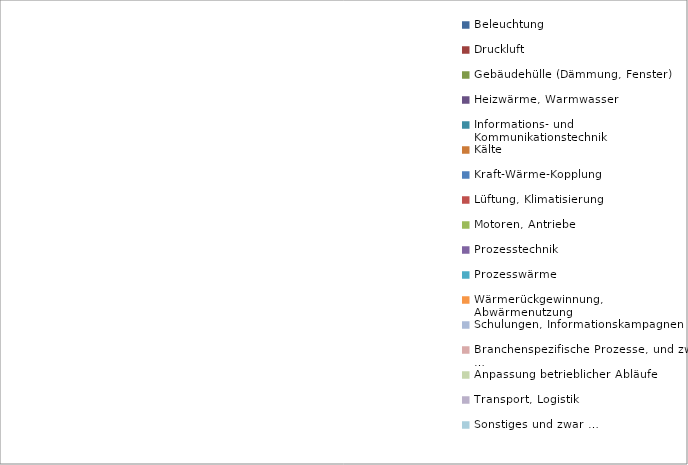
| Category | Series 0 |
|---|---|
| Beleuchtung | 0 |
| Druckluft | 0 |
| Gebäudehülle (Dämmung, Fenster) | 0 |
| Heizwärme, Warmwasser | 0 |
| Informations- und Kommunikationstechnik | 0 |
| Kälte | 0 |
| Kraft-Wärme-Kopplung | 0 |
| Lüftung, Klimatisierung | 0 |
| Motoren, Antriebe | 0 |
| Prozesstechnik | 0 |
| Prozesswärme | 0 |
| Wärmerückgewinnung, Abwärmenutzung | 0 |
| Schulungen, Informationskampagnen | 0 |
| Branchenspezifische Prozesse, und zwar … | 0 |
| Anpassung betrieblicher Abläufe | 0 |
| Transport, Logistik | 0 |
| Sonstiges und zwar … | 0 |